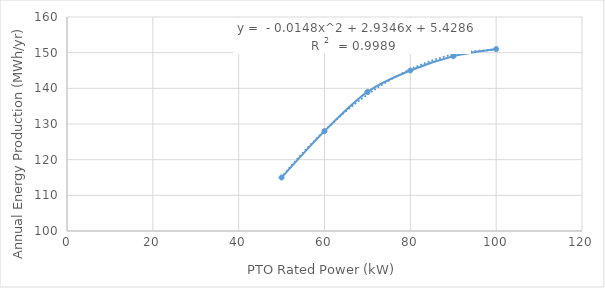
| Category | AEP |
|---|---|
| 50.0 | 115 |
| 60.0 | 128 |
| 70.0 | 139 |
| 80.0 | 145 |
| 90.0 | 149 |
| 100.0 | 151 |